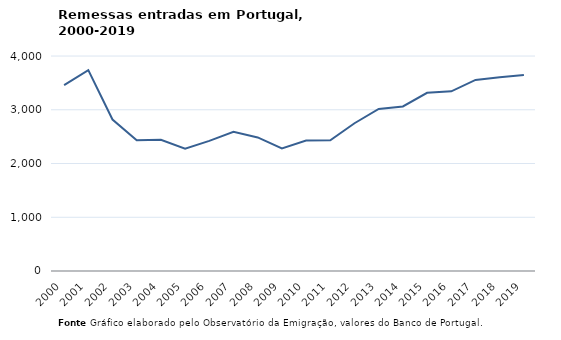
| Category | Entradas |
|---|---|
| 2000.0 | 3458.12 |
| 2001.0 | 3736.82 |
| 2002.0 | 2817.88 |
| 2003.0 | 2433.78 |
| 2004.0 | 2442.16 |
| 2005.0 | 2277.25 |
| 2006.0 | 2420.27 |
| 2007.0 | 2588.42 |
| 2008.0 | 2484.68 |
| 2009.0 | 2281.87 |
| 2010.0 | 2425.9 |
| 2011.0 | 2430.49 |
| 2012.0 | 2749.46 |
| 2013.0 | 3015.78 |
| 2014.0 | 3060.71 |
| 2015.0 | 3316 |
| 2016.0 | 3343 |
| 2017.0 | 3555 |
| 2018.0 | 3604.01 |
| 2019.0 | 3645.23 |